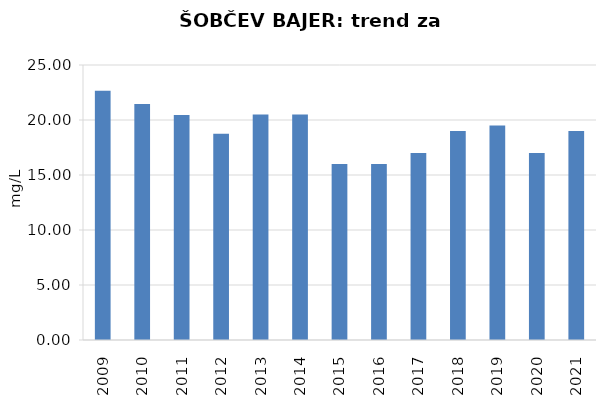
| Category | Vsota |
|---|---|
| 2009 | 22.65 |
| 2010 | 21.45 |
| 2011 | 20.45 |
| 2012 | 18.75 |
| 2013 | 20.5 |
| 2014 | 20.5 |
| 2015 | 16 |
| 2016 | 16 |
| 2017 | 17 |
| 2018 | 19 |
| 2019 | 19.5 |
| 2020 | 17 |
| 2021 | 19 |